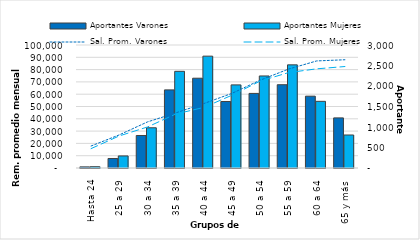
| Category | Aportantes Varones | Aportantes Mujeres |
|---|---|---|
| 0 | 27 | 31 |
| 1 | 232 | 294 |
| 2 | 793 | 981 |
| 3 | 1905 | 2358 |
| 4 | 2190 | 2728 |
| 5 | 1622 | 2027 |
| 6 | 1819 | 2245 |
| 7 | 2031 | 2516 |
| 8 | 1752 | 1626 |
| 9 | 1222 | 805 |